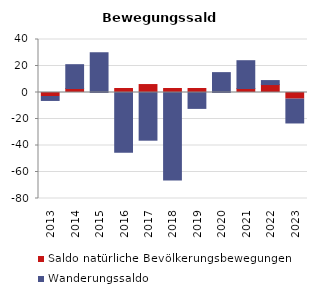
| Category | Saldo natürliche Bevölkerungsbewegungen | Wanderungssaldo |
|---|---|---|
| 2013.0 | -3 | -3 |
| 2014.0 | 3 | 18 |
| 2015.0 | 0 | 30 |
| 2016.0 | 3 | -45 |
| 2017.0 | 6 | -36 |
| 2018.0 | 3 | -66 |
| 2019.0 | 3 | -12 |
| 2020.0 | 0 | 15 |
| 2021.0 | 3 | 21 |
| 2022.0 | 6 | 3 |
| 2023.0 | -5 | -18 |